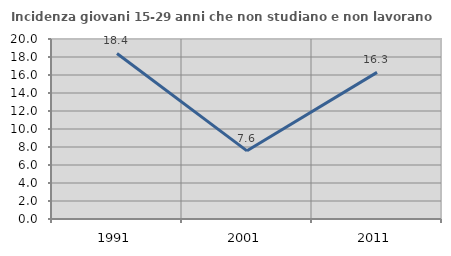
| Category | Incidenza giovani 15-29 anni che non studiano e non lavorano  |
|---|---|
| 1991.0 | 18.395 |
| 2001.0 | 7.574 |
| 2011.0 | 16.294 |